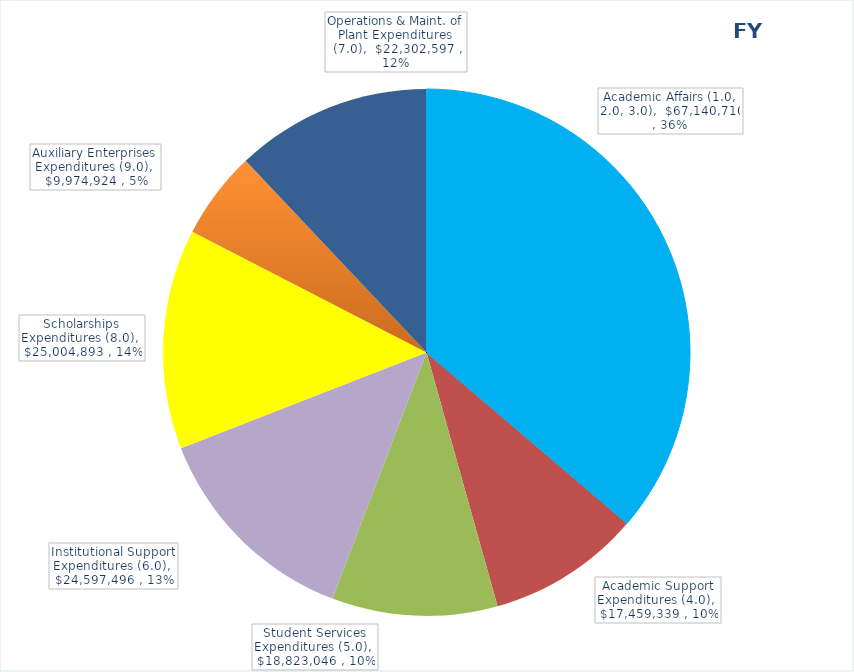
| Category | FY 2010 |
|---|---|
| Academic Affairs (1.0, 2.0, 3.0) | 67140710.42 |
| Academic Support Expenditures (4.0) | 17459339.05 |
| Student Services Expenditures (5.0) | 18823046.08 |
| Institutional Support Expenditures (6.0) | 24597496.21 |
| Scholarships Expenditures (8.0) | 25004892.71 |
| Auxiliary Enterprises Expenditures (9.0) | 9974924.02 |
| Operations & Maint. of Plant Expenditures (7.0) | 22302596.63 |